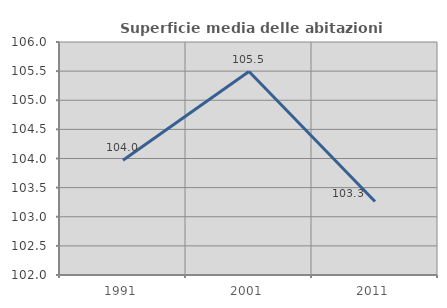
| Category | Superficie media delle abitazioni occupate |
|---|---|
| 1991.0 | 103.969 |
| 2001.0 | 105.493 |
| 2011.0 | 103.262 |